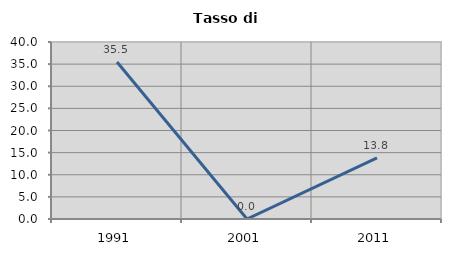
| Category | Tasso di disoccupazione   |
|---|---|
| 1991.0 | 35.484 |
| 2001.0 | 0 |
| 2011.0 | 13.793 |